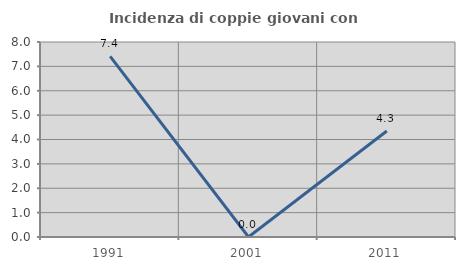
| Category | Incidenza di coppie giovani con figli |
|---|---|
| 1991.0 | 7.407 |
| 2001.0 | 0 |
| 2011.0 | 4.348 |